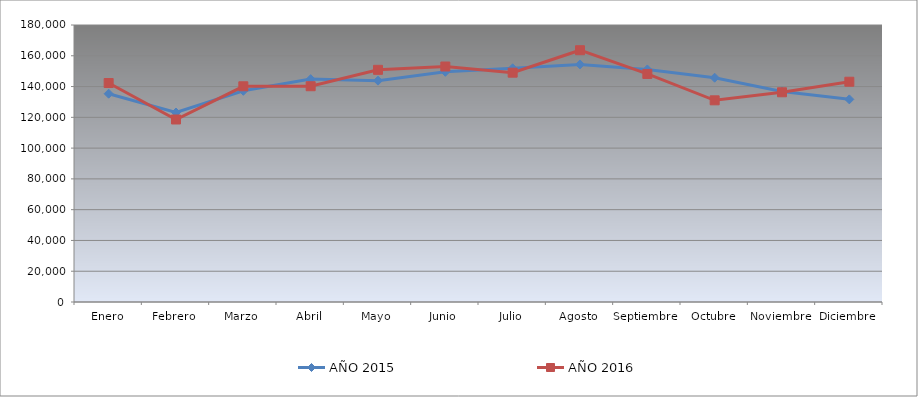
| Category | AÑO 2015 | AÑO 2016 |
|---|---|---|
| Enero | 135349.802 | 142308.771 |
| Febrero | 123136.342 | 118598.698 |
| Marzo | 137229.661 | 140178.796 |
| Abril | 144830.967 | 140214.241 |
| Mayo | 143842.074 | 150873.785 |
| Junio | 149569.943 | 153029.539 |
| Julio | 151881.639 | 149020.932 |
| Agosto | 154369.923 | 163618.191 |
| Septiembre | 151133.549 | 148196.01 |
| Octubre | 145752.434 | 131059.537 |
| Noviembre | 136831.535 | 136281.36 |
| Diciembre | 131676.774 | 143133.693 |